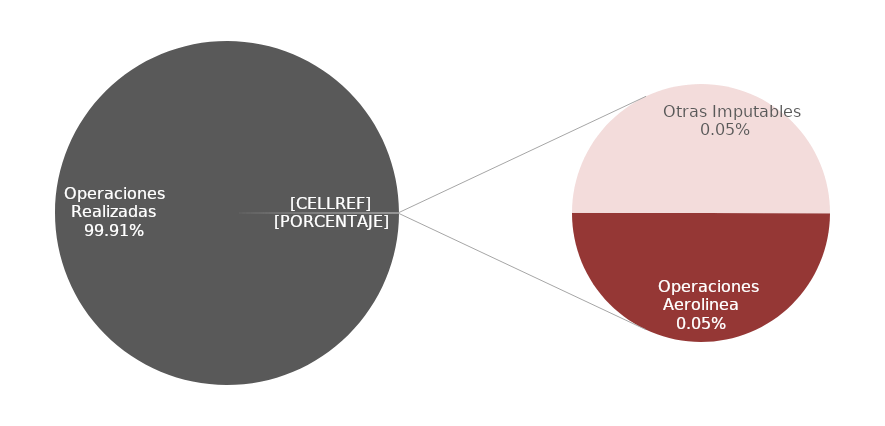
| Category | Series 0 |
|---|---|
| Operaciones Realizadas | 2182 |
|    Operaciones Aerolinea | 1 |
|    Mantenimiento Aeronaves | 0 |
|    Otras Imputables | 1 |
|    Meteorologia | 0 |
|    Otras No Imputables | 0 |